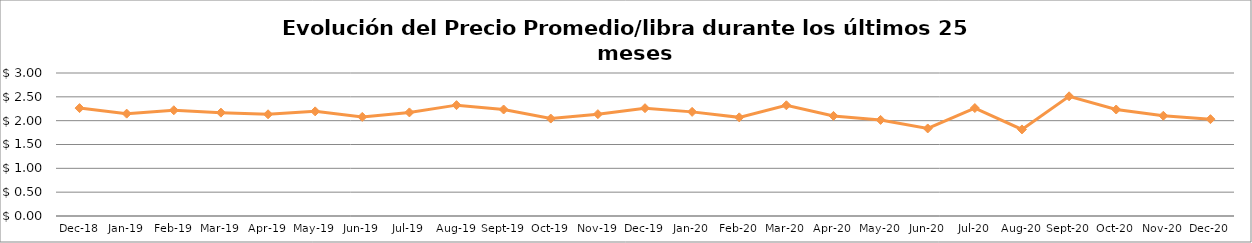
| Category | Series 0 |
|---|---|
| 2018-12-01 | 2.264 |
| 2019-01-01 | 2.147 |
| 2019-02-01 | 2.218 |
| 2019-03-01 | 2.169 |
| 2019-04-01 | 2.134 |
| 2019-05-01 | 2.195 |
| 2019-06-01 | 2.079 |
| 2019-07-01 | 2.173 |
| 2019-08-01 | 2.326 |
| 2019-09-01 | 2.234 |
| 2019-10-01 | 2.044 |
| 2019-11-01 | 2.137 |
| 2019-12-01 | 2.262 |
| 2020-01-01 | 2.185 |
| 2020-02-01 | 2.069 |
| 2020-03-01 | 2.323 |
| 2020-04-01 | 2.1 |
| 2020-05-01 | 2.016 |
| 2020-06-01 | 1.837 |
| 2020-07-01 | 2.265 |
| 2020-08-01 | 1.816 |
| 2020-09-01 | 2.511 |
| 2020-10-01 | 2.234 |
| 2020-11-01 | 2.103 |
| 2020-12-01 | 2.031 |